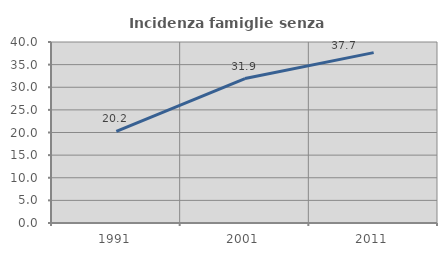
| Category | Incidenza famiglie senza nuclei |
|---|---|
| 1991.0 | 20.225 |
| 2001.0 | 31.915 |
| 2011.0 | 37.653 |